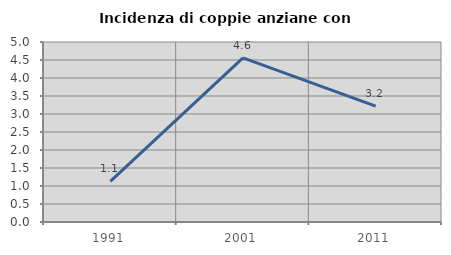
| Category | Incidenza di coppie anziane con figli |
|---|---|
| 1991.0 | 1.131 |
| 2001.0 | 4.56 |
| 2011.0 | 3.221 |